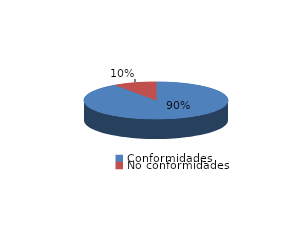
| Category | Series 0 |
|---|---|
| Conformidades | 1505 |
| No conformidades | 159 |